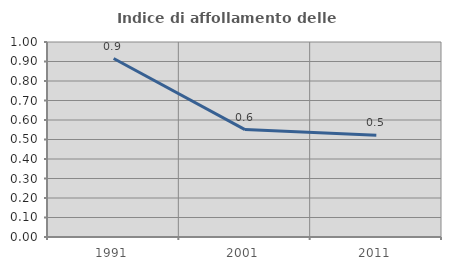
| Category | Indice di affollamento delle abitazioni  |
|---|---|
| 1991.0 | 0.915 |
| 2001.0 | 0.551 |
| 2011.0 | 0.522 |